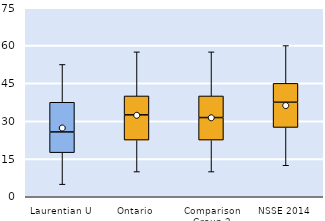
| Category | 25th | 50th | 75th |
|---|---|---|---|
| Laurentian U | 17.5 | 8.214 | 11.786 |
| Ontario | 22.5 | 10 | 7.5 |
| Comparison Group 2 | 22.5 | 8.929 | 8.571 |
| NSSE 2014 | 27.5 | 10 | 7.5 |